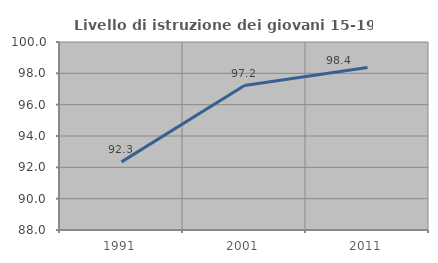
| Category | Livello di istruzione dei giovani 15-19 anni |
|---|---|
| 1991.0 | 92.347 |
| 2001.0 | 97.222 |
| 2011.0 | 98.374 |